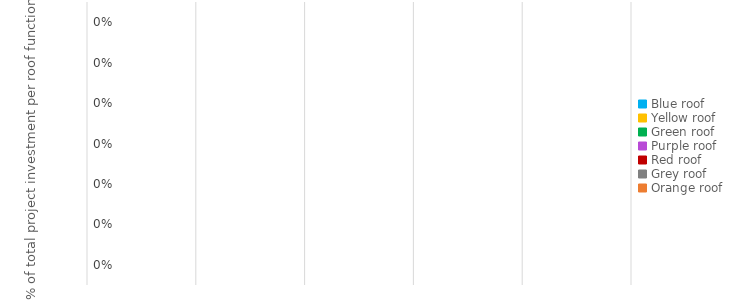
| Category | % van total investing project |
|---|---|
| Blue roof | 0 |
| Yellow roof | 0 |
| Green roof | 0 |
| Purple roof | 0 |
| Red roof | 0 |
| Grey roof | 0 |
| Orange roof | 0 |